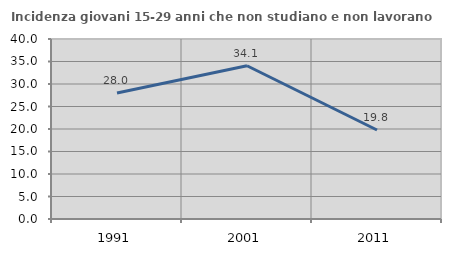
| Category | Incidenza giovani 15-29 anni che non studiano e non lavorano  |
|---|---|
| 1991.0 | 28.009 |
| 2001.0 | 34.062 |
| 2011.0 | 19.778 |